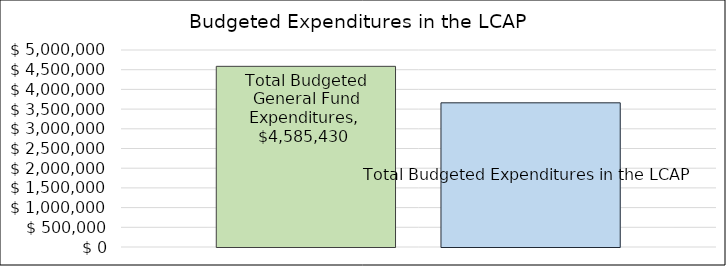
| Category | Total Budgeted General Fund Expenditures | Total Budgeted Expenditures in the LCAP |
|---|---|---|
| 0 | 4585430 | 3659425 |